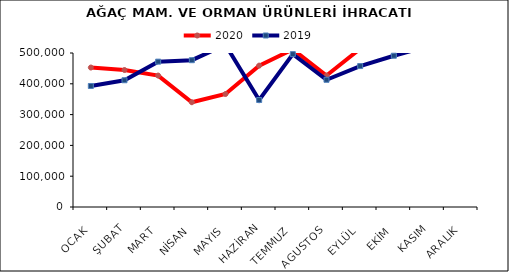
| Category | 2020 | 2019 |
|---|---|---|
| OCAK | 452788.839 | 392885.267 |
| ŞUBAT | 444729.095 | 411556.501 |
| MART | 426749.434 | 471941.553 |
| NİSAN | 340174.23 | 476663.482 |
| MAYIS | 366810.395 | 526647.315 |
| HAZİRAN | 459027.121 | 347422.27 |
| TEMMUZ | 511755.247 | 496254.214 |
| AGUSTOS | 426906.856 | 413016.866 |
| EYLÜL | 513796.125 | 457542.624 |
| EKİM | 527028.884 | 491128.92 |
| KASIM | 522504.561 | 521156.716 |
| ARALIK | 574234.698 | 523779.123 |